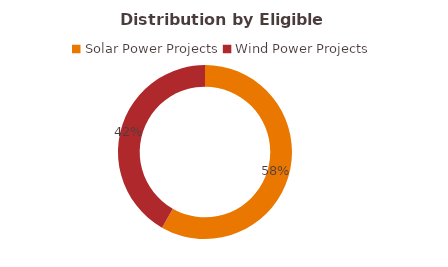
| Category | Solar Power Projects |
|---|---|
| Solar Power Projects | 0.582 |
| Wind Power Projects | 0.418 |